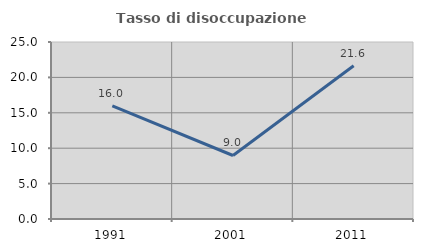
| Category | Tasso di disoccupazione giovanile  |
|---|---|
| 1991.0 | 15.991 |
| 2001.0 | 8.97 |
| 2011.0 | 21.637 |